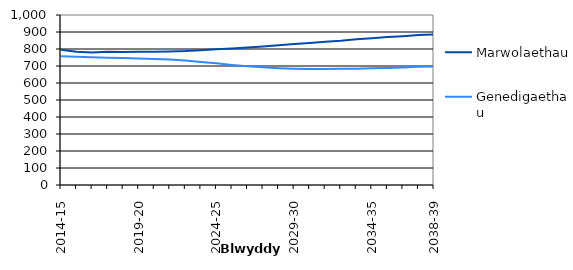
| Category | Marwolaethau | Genedigaethau |
|---|---|---|
| 2014-15 | 795.659 | 757.655 |
|  | 783.591 | 753.686 |
|  | 779.612 | 751.141 |
|  | 783.795 | 748.257 |
|  | 782.068 | 746.437 |
| 2019-20 | 783.954 | 744.825 |
|  | 783.851 | 741.788 |
|  | 785.585 | 738.732 |
|  | 787.598 | 732.456 |
|  | 793.278 | 724.053 |
| 2024-25 | 798.423 | 715.576 |
|  | 802.616 | 706.405 |
|  | 808.494 | 698.051 |
|  | 815.141 | 691.97 |
|  | 822.274 | 687.161 |
| 2029-30 | 829.448 | 683.664 |
|  | 835.907 | 681.97 |
|  | 842.511 | 681.938 |
|  | 848.498 | 683.302 |
|  | 856.921 | 684.552 |
| 2034-35 | 863.353 | 686.113 |
|  | 870.21 | 688.618 |
|  | 875.237 | 691.829 |
|  | 881.786 | 694.95 |
| 2038-39 | 885.527 | 697.756 |